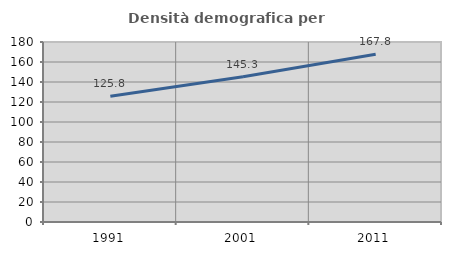
| Category | Densità demografica |
|---|---|
| 1991.0 | 125.788 |
| 2001.0 | 145.295 |
| 2011.0 | 167.78 |